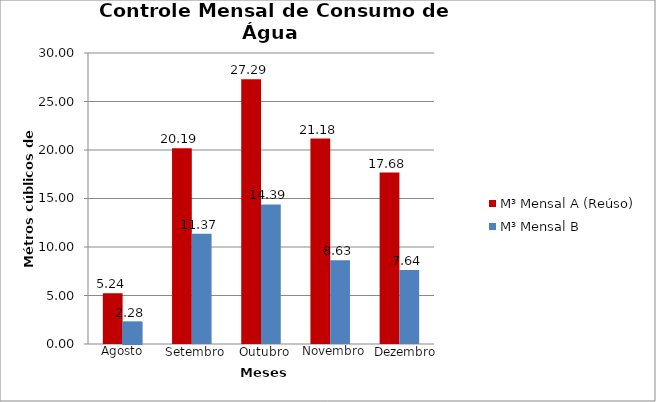
| Category | M³ Mensal A (Reúso) | M³ Mensal B  |
|---|---|---|
| 0 | 5.24 | 2.28 |
| 1 | 20.19 | 11.37 |
| 2 | 27.29 | 14.39 |
| 3 | 21.18 | 8.63 |
| 4 | 17.68 | 7.64 |